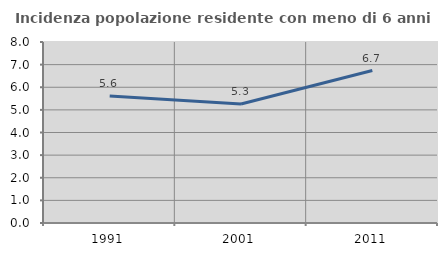
| Category | Incidenza popolazione residente con meno di 6 anni |
|---|---|
| 1991.0 | 5.611 |
| 2001.0 | 5.258 |
| 2011.0 | 6.737 |